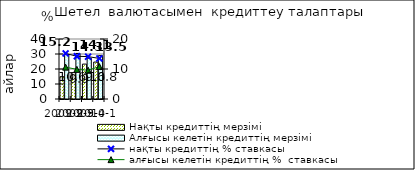
| Category | Нақты кредиттің мерзімі  | Алғысы келетін кредиттің мерзімі  |
|---|---|---|
| 2009-2 | 14.87 | 29.6 |
| 2009-3 | 17.62 | 30.36 |
| 2009-4 | 23.27 | 27.19 |
| 2010-1 | 24.63 | 28.91 |